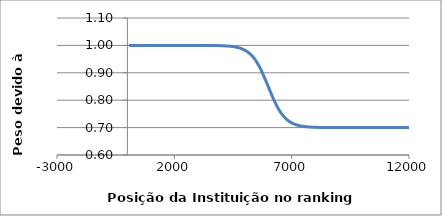
| Category | Series 0 |
|---|---|
| 71.0 | 1 |
| 227.0 | 1 |
| 271.0 | 1 |
| 369.0 | 1 |
| 408.0 | 1 |
| 420.0 | 1 |
| 448.0 | 1 |
| 640.0 | 1 |
| 691.0 | 1 |
| 737.0 | 1 |
| 746.0 | 1 |
| 750.0 | 1 |
| 802.0 | 1 |
| 822.0 | 1 |
| 822.0 | 1 |
| 827.0 | 1 |
| 850.0 | 1 |
| 945.0 | 1 |
| 960.0 | 1 |
| 1107.0 | 1 |
| 1109.0 | 1 |
| 1183.0 | 1 |
| 1187.0 | 1 |
| 1190.0 | 1 |
| 1251.0 | 1 |
| 1270.0 | 1 |
| 1276.0 | 1 |
| 1334.0 | 1 |
| 1340.0 | 1 |
| 1349.0 | 1 |
| 1454.0 | 1 |
| 1492.0 | 1 |
| 1534.0 | 1 |
| 1609.0 | 1 |
| 1686.0 | 1 |
| 1703.0 | 1 |
| 1716.0 | 1 |
| 1719.0 | 1 |
| 1745.0 | 1 |
| 1763.0 | 1 |
| 1815.0 | 1 |
| 1880.0 | 1 |
| 1927.0 | 1 |
| 1946.0 | 1 |
| 1954.0 | 1 |
| 2006.0 | 1 |
| 2032.0 | 1 |
| 2116.0 | 1 |
| 2116.0 | 1 |
| 2139.0 | 1 |
| 2199.0 | 1 |
| 2214.0 | 1 |
| 2214.0 | 1 |
| 2221.0 | 1 |
| 2233.0 | 1 |
| 2240.0 | 1 |
| 2280.0 | 1 |
| 2390.0 | 1 |
| 2402.0 | 1 |
| 2407.0 | 1 |
| 2411.0 | 1 |
| 2416.0 | 1 |
| 2421.0 | 1 |
| 2436.0 | 1 |
| 2464.0 | 1 |
| 2476.0 | 1 |
| 2598.0 | 1 |
| 2654.0 | 1 |
| 2658.0 | 1 |
| 2663.0 | 1 |
| 2698.0 | 1 |
| 2702.0 | 1 |
| 2712.0 | 1 |
| 2728.0 | 1 |
| 2770.0 | 1 |
| 2788.0 | 1 |
| 2807.0 | 1 |
| 2809.0 | 1 |
| 2833.0 | 1 |
| 2837.0 | 1 |
| 2882.0 | 1 |
| 2897.0 | 1 |
| 2934.0 | 1 |
| 2969.0 | 1 |
| 2987.0 | 1 |
| 3000.0 | 1 |
| 3013.0 | 1 |
| 3057.0 | 1 |
| 3071.0 | 1 |
| 3081.0 | 1 |
| 3123.0 | 1 |
| 3123.0 | 1 |
| 3126.0 | 1 |
| 3131.0 | 1 |
| 3141.0 | 1 |
| 3160.0 | 1 |
| 3180.0 | 1 |
| 3185.0 | 1 |
| 3194.0 | 1 |
| 3203.0 | 1 |
| 3218.0 | 1 |
| 3221.0 | 1 |
| 3240.0 | 1 |
| 3257.0 | 1 |
| 3271.0 | 1 |
| 3277.0 | 1 |
| 3314.0 | 1 |
| 3403.0 | 1 |
| 3413.0 | 1 |
| 3416.0 | 1 |
| 3420.0 | 1 |
| 3486.0 | 1 |
| 3509.0 | 1 |
| 3514.0 | 1 |
| 3515.0 | 1 |
| 3522.0 | 1 |
| 3537.0 | 1 |
| 3540.0 | 1 |
| 3551.0 | 1 |
| 3554.0 | 1 |
| 3571.0 | 1 |
| 3597.0 | 1 |
| 3599.0 | 1 |
| 3617.0 | 1 |
| 3617.0 | 1 |
| 3629.0 | 1 |
| 3635.0 | 1 |
| 3649.0 | 1 |
| 3664.0 | 1 |
| 3668.0 | 1 |
| 3680.0 | 1 |
| 3680.0 | 1 |
| 3700.0 | 1 |
| 3716.0 | 0.999 |
| 3720.0 | 0.999 |
| 3760.0 | 0.999 |
| 3788.0 | 0.999 |
| 3809.0 | 0.999 |
| 3839.0 | 0.999 |
| 3852.0 | 0.999 |
| 3857.0 | 0.999 |
| 3861.0 | 0.999 |
| 3885.0 | 0.999 |
| 3915.0 | 0.999 |
| 3937.0 | 0.999 |
| 3950.0 | 0.999 |
| 3957.0 | 0.999 |
| 3980.0 | 0.999 |
| 4028.0 | 0.999 |
| 4035.0 | 0.999 |
| 4069.0 | 0.999 |
| 4089.0 | 0.999 |
| 4109.0 | 0.999 |
| 4147.0 | 0.998 |
| 4220.0 | 0.998 |
| 4230.0 | 0.998 |
| 4233.0 | 0.998 |
| 4254.0 | 0.998 |
| 4375.0 | 0.997 |
| 4450.0 | 0.996 |
| 4459.0 | 0.996 |
| 4504.0 | 0.996 |
| 4553.0 | 0.995 |
| 4580.0 | 0.994 |
| 4582.0 | 0.994 |
| 4591.0 | 0.994 |
| 4636.0 | 0.994 |
| 4652.0 | 0.993 |
| 4667.0 | 0.993 |
| 4707.0 | 0.992 |
| 4718.0 | 0.992 |
| 4782.0 | 0.99 |
| 4854.0 | 0.988 |
| 4885.0 | 0.987 |
| 4978.0 | 0.984 |
| 4990.0 | 0.983 |
| 5088.0 | 0.978 |
| 5154.0 | 0.974 |
| 5181.0 | 0.972 |
| 5193.0 | 0.972 |
| 5255.0 | 0.967 |
| 5267.0 | 0.966 |
| 5272.0 | 0.965 |
| 5277.0 | 0.965 |
| 5326.0 | 0.961 |
| 5353.0 | 0.958 |
| 5387.0 | 0.954 |
| 5392.0 | 0.954 |
| 5419.0 | 0.951 |
| 5437.0 | 0.949 |
| 5479.0 | 0.943 |
| 5486.0 | 0.942 |
| 5509.0 | 0.939 |
| 5539.0 | 0.935 |
| 5601.0 | 0.926 |
| 5612.0 | 0.924 |
| 5626.0 | 0.922 |
| 5644.0 | 0.919 |
| 5669.0 | 0.915 |
| 5725.0 | 0.905 |
| 5732.0 | 0.904 |
| 5891.0 | 0.873 |
| 5895.0 | 0.872 |
| 5930.0 | 0.865 |
| 5937.0 | 0.863 |
| 6029.0 | 0.844 |
| 6043.0 | 0.841 |
| 6058.0 | 0.838 |
| 6163.0 | 0.816 |
| 6222.0 | 0.805 |
| 6222.0 | 0.805 |
| 6314.0 | 0.788 |
| 6322.0 | 0.787 |
| 6410.0 | 0.772 |
| 6423.0 | 0.77 |
| 6501.0 | 0.759 |
| 6589.0 | 0.748 |
| 6589.0 | 0.748 |
| 6615.0 | 0.745 |
| 6622.0 | 0.745 |
| 6688.0 | 0.738 |
| 6723.0 | 0.735 |
| 6755.0 | 0.732 |
| 6784.0 | 0.73 |
| 6800.0 | 0.729 |
| 6808.0 | 0.728 |
| 6856.0 | 0.725 |
| 6856.0 | 0.725 |
| 6867.0 | 0.724 |
| 6900.0 | 0.722 |
| 6905.0 | 0.722 |
| 6949.0 | 0.72 |
| 7017.0 | 0.716 |
| 7115.0 | 0.713 |
| 7123.0 | 0.712 |
| 7125.0 | 0.712 |
| 7224.0 | 0.709 |
| 7231.0 | 0.709 |
| 7293.0 | 0.708 |
| 7323.0 | 0.707 |
| 7360.0 | 0.707 |
| 7498.0 | 0.704 |
| 7569.0 | 0.704 |
| 7589.0 | 0.703 |
| 7598.0 | 0.703 |
| 7611.0 | 0.703 |
| 7666.0 | 0.703 |
| 7683.0 | 0.703 |
| 7687.0 | 0.703 |
| 7741.0 | 0.702 |
| 7754.0 | 0.702 |
| 7778.0 | 0.702 |
| 7783.0 | 0.702 |
| 7808.0 | 0.702 |
| 7816.0 | 0.702 |
| 7832.0 | 0.702 |
| 7841.0 | 0.702 |
| 7853.0 | 0.702 |
| 7875.0 | 0.702 |
| 7893.0 | 0.701 |
| 7926.0 | 0.701 |
| 7939.0 | 0.701 |
| 7939.0 | 0.701 |
| 7968.0 | 0.701 |
| 8053.0 | 0.701 |
| 8090.0 | 0.701 |
| 8205.0 | 0.701 |
| 8220.0 | 0.701 |
| 8266.0 | 0.701 |
| 8291.0 | 0.7 |
| 8388.0 | 0.7 |
| 8538.0 | 0.7 |
| 8538.0 | 0.7 |
| 8553.0 | 0.7 |
| 8613.0 | 0.7 |
| 8643.0 | 0.7 |
| 8685.0 | 0.7 |
| 8685.0 | 0.7 |
| 8898.0 | 0.7 |
| 8942.0 | 0.7 |
| 9110.0 | 0.7 |
| 9170.0 | 0.7 |
| 9203.0 | 0.7 |
| 9215.0 | 0.7 |
| 9244.0 | 0.7 |
| 9273.0 | 0.7 |
| 9384.0 | 0.7 |
| 9384.0 | 0.7 |
| 9458.0 | 0.7 |
| 9472.0 | 0.7 |
| 9568.0 | 0.7 |
| 9688.0 | 0.7 |
| 9719.0 | 0.7 |
| 9757.0 | 0.7 |
| 9877.0 | 0.7 |
| 9924.0 | 0.7 |
| 9951.0 | 0.7 |
| 9978.0 | 0.7 |
| 10008.0 | 0.7 |
| 10053.0 | 0.7 |
| 10110.0 | 0.7 |
| 10180.0 | 0.7 |
| 10229.0 | 0.7 |
| 10236.0 | 0.7 |
| 10325.0 | 0.7 |
| 10348.0 | 0.7 |
| 10392.0 | 0.7 |
| 10439.0 | 0.7 |
| 10463.0 | 0.7 |
| 10505.0 | 0.7 |
| 10552.0 | 0.7 |
| 10643.0 | 0.7 |
| 10737.0 | 0.7 |
| 10762.0 | 0.7 |
| 10806.0 | 0.7 |
| 10817.0 | 0.7 |
| 10817.0 | 0.7 |
| 10831.0 | 0.7 |
| 10860.0 | 0.7 |
| 10926.0 | 0.7 |
| 10935.0 | 0.7 |
| 10935.0 | 0.7 |
| 10935.0 | 0.7 |
| 10972.0 | 0.7 |
| 11037.0 | 0.7 |
| 11052.0 | 0.7 |
| 11064.0 | 0.7 |
| 11085.0 | 0.7 |
| 11118.0 | 0.7 |
| 11144.0 | 0.7 |
| 11154.0 | 0.7 |
| 11177.0 | 0.7 |
| 11237.0 | 0.7 |
| 11265.0 | 0.7 |
| 11306.0 | 0.7 |
| 11315.0 | 0.7 |
| 11378.0 | 0.7 |
| 11412.0 | 0.7 |
| 11501.0 | 0.7 |
| 11547.0 | 0.7 |
| 11562.0 | 0.7 |
| 11584.0 | 0.7 |
| 11671.0 | 0.7 |
| 11762.0 | 0.7 |
| 11797.0 | 0.7 |
| 11872.0 | 0.7 |
| 11885.0 | 0.7 |
| 11944.0 | 0.7 |
| 11986.0 | 0.7 |
| 11999.0 | 0.7 |
| 12065.0 | 0.7 |
| 12085.0 | 0.7 |
| 12093.0 | 0.7 |
| 12126.0 | 0.7 |
| 12162.0 | 0.7 |
| 12175.0 | 0.7 |
| 12188.0 | 0.7 |
| 12240.0 | 0.7 |
| 12295.0 | 0.7 |
| 12349.0 | 0.7 |
| 12355.0 | 0.7 |
| 12377.0 | 0.7 |
| 12420.0 | 0.7 |
| 12443.0 | 0.7 |
| 12468.0 | 0.7 |
| 12517.0 | 0.7 |
| 12532.0 | 0.7 |
| 12563.0 | 0.7 |
| 12615.0 | 0.7 |
| 12701.0 | 0.7 |
| 12772.0 | 0.7 |
| 12808.0 | 0.7 |
| 12827.0 | 0.7 |
| 12867.0 | 0.7 |
| 12897.0 | 0.7 |
| 12897.0 | 0.7 |
| 12912.0 | 0.7 |
| 12912.0 | 0.7 |
| 12935.0 | 0.7 |
| 12935.0 | 0.7 |
| 12955.0 | 0.7 |
| 12955.0 | 0.7 |
| 13056.0 | 0.7 |
| 13080.0 | 0.7 |
| 13110.0 | 0.7 |
| 13139.0 | 0.7 |
| 13186.0 | 0.7 |
| 13207.0 | 0.7 |
| 13214.0 | 0.7 |
| 13252.0 | 0.7 |
| 13261.0 | 0.7 |
| 13278.0 | 0.7 |
| 13335.0 | 0.7 |
| 13402.0 | 0.7 |
| 13402.0 | 0.7 |
| 13437.0 | 0.7 |
| 13483.0 | 0.7 |
| 13492.0 | 0.7 |
| 13508.0 | 0.7 |
| 13569.0 | 0.7 |
| 13575.0 | 0.7 |
| 13588.0 | 0.7 |
| 13603.0 | 0.7 |
| 13611.0 | 0.7 |
| 13629.0 | 0.7 |
| 13705.0 | 0.7 |
| 13713.0 | 0.7 |
| 13738.0 | 0.7 |
| 13746.0 | 0.7 |
| 13780.0 | 0.7 |
| 13825.0 | 0.7 |
| 13866.0 | 0.7 |
| 13928.0 | 0.7 |
| 13936.0 | 0.7 |
| 13994.0 | 0.7 |
| 14020.0 | 0.7 |
| 14040.0 | 0.7 |
| 14049.0 | 0.7 |
| 14049.0 | 0.7 |
| 14063.0 | 0.7 |
| 14153.0 | 0.7 |
| 14169.0 | 0.7 |
| 14169.0 | 0.7 |
| 14180.0 | 0.7 |
| 14188.0 | 0.7 |
| 14289.0 | 0.7 |
| 14399.0 | 0.7 |
| 14411.0 | 0.7 |
| 14411.0 | 0.7 |
| 14483.0 | 0.7 |
| 14509.0 | 0.7 |
| 14541.0 | 0.7 |
| 14547.0 | 0.7 |
| 14566.0 | 0.7 |
| 14637.0 | 0.7 |
| 14650.0 | 0.7 |
| 14660.0 | 0.7 |
| 14711.0 | 0.7 |
| 14762.0 | 0.7 |
| 14828.0 | 0.7 |
| 14842.0 | 0.7 |
| 14870.0 | 0.7 |
| 14885.0 | 0.7 |
| 14914.0 | 0.7 |
| 14924.0 | 0.7 |
| 14940.0 | 0.7 |
| 14949.0 | 0.7 |
| 14972.0 | 0.7 |
| 15011.0 | 0.7 |
| 15023.0 | 0.7 |
| 15039.0 | 0.7 |
| 15101.0 | 0.7 |
| 15136.0 | 0.7 |
| 15170.0 | 0.7 |
| 15179.0 | 0.7 |
| 15179.0 | 0.7 |
| 15201.0 | 0.7 |
| 15240.0 | 0.7 |
| 15255.0 | 0.7 |
| 15255.0 | 0.7 |
| 15267.0 | 0.7 |
| 15267.0 | 0.7 |
| 15298.0 | 0.7 |
| 15298.0 | 0.7 |
| 15394.0 | 0.7 |
| 15407.0 | 0.7 |
| 15497.0 | 0.7 |
| 15519.0 | 0.7 |
| 15540.0 | 0.7 |
| 15566.0 | 0.7 |
| 15593.0 | 0.7 |
| 15598.0 | 0.7 |
| 15598.0 | 0.7 |
| 15676.0 | 0.7 |
| 15702.0 | 0.7 |
| 15702.0 | 0.7 |
| 15769.0 | 0.7 |
| 15792.0 | 0.7 |
| 15812.0 | 0.7 |
| 15852.0 | 0.7 |
| 15863.0 | 0.7 |
| 15934.0 | 0.7 |
| 16046.0 | 0.7 |
| 16089.0 | 0.7 |
| 16115.0 | 0.7 |
| 16115.0 | 0.7 |
| 16144.0 | 0.7 |
| 16199.0 | 0.7 |
| 16214.0 | 0.7 |
| 16227.0 | 0.7 |
| 16278.0 | 0.7 |
| 16299.0 | 0.7 |
| 16328.0 | 0.7 |
| 16475.0 | 0.7 |
| 16475.0 | 0.7 |
| 16508.0 | 0.7 |
| 16526.0 | 0.7 |
| 16526.0 | 0.7 |
| 16539.0 | 0.7 |
| 16556.0 | 0.7 |
| 16565.0 | 0.7 |
| 16572.0 | 0.7 |
| 16591.0 | 0.7 |
| 16631.0 | 0.7 |
| 16631.0 | 0.7 |
| 16631.0 | 0.7 |
| 16675.0 | 0.7 |
| 16687.0 | 0.7 |
| 16696.0 | 0.7 |
| 16696.0 | 0.7 |
| 16708.0 | 0.7 |
| 16759.0 | 0.7 |
| 16801.0 | 0.7 |
| 16801.0 | 0.7 |
| 16837.0 | 0.7 |
| 16846.0 | 0.7 |
| 16854.0 | 0.7 |
| 16854.0 | 0.7 |
| 16854.0 | 0.7 |
| 16893.0 | 0.7 |
| 16908.0 | 0.7 |
| 16916.0 | 0.7 |
| 16930.0 | 0.7 |
| 16946.0 | 0.7 |
| 16957.0 | 0.7 |
| 16957.0 | 0.7 |
| 16966.0 | 0.7 |
| 16974.0 | 0.7 |
| 16974.0 | 0.7 |
| 17014.0 | 0.7 |
| 17025.0 | 0.7 |
| 17092.0 | 0.7 |
| 17141.0 | 0.7 |
| 17141.0 | 0.7 |
| 17168.0 | 0.7 |
| 17168.0 | 0.7 |
| 17182.0 | 0.7 |
| 17182.0 | 0.7 |
| 17258.0 | 0.7 |
| 17268.0 | 0.7 |
| 17275.0 | 0.7 |
| 17285.0 | 0.7 |
| 17292.0 | 0.7 |
| 17323.0 | 0.7 |
| 17333.0 | 0.7 |
| 17333.0 | 0.7 |
| 17346.0 | 0.7 |
| 17371.0 | 0.7 |
| 17399.0 | 0.7 |
| 17399.0 | 0.7 |
| 17399.0 | 0.7 |
| 17414.0 | 0.7 |
| 17426.0 | 0.7 |
| 17436.0 | 0.7 |
| 17444.0 | 0.7 |
| 17455.0 | 0.7 |
| 17492.0 | 0.7 |
| 17512.0 | 0.7 |
| 17512.0 | 0.7 |
| 17551.0 | 0.7 |
| 17568.0 | 0.7 |
| 17581.0 | 0.7 |
| 17594.0 | 0.7 |
| 17623.0 | 0.7 |
| 17645.0 | 0.7 |
| 17674.0 | 0.7 |
| 17703.0 | 0.7 |
| 17727.0 | 0.7 |
| 17746.0 | 0.7 |
| 17808.0 | 0.7 |
| 17820.0 | 0.7 |
| 17886.0 | 0.7 |
| 17892.0 | 0.7 |
| 17892.0 | 0.7 |
| 17918.0 | 0.7 |
| 17957.0 | 0.7 |
| 17968.0 | 0.7 |
| 17988.0 | 0.7 |
| 18016.0 | 0.7 |
| 18028.0 | 0.7 |
| 18039.0 | 0.7 |
| 18091.0 | 0.7 |
| 18091.0 | 0.7 |
| 18104.0 | 0.7 |
| 18104.0 | 0.7 |
| 18115.0 | 0.7 |
| 18115.0 | 0.7 |
| 18138.0 | 0.7 |
| 18138.0 | 0.7 |
| 18154.0 | 0.7 |
| 18154.0 | 0.7 |
| 18171.0 | 0.7 |
| 18185.0 | 0.7 |
| 18206.0 | 0.7 |
| 18239.0 | 0.7 |
| 18258.0 | 0.7 |
| 18269.0 | 0.7 |
| 18275.0 | 0.7 |
| 18283.0 | 0.7 |
| 18293.0 | 0.7 |
| 18301.0 | 0.7 |
| 18301.0 | 0.7 |
| 18301.0 | 0.7 |
| 18321.0 | 0.7 |
| 18321.0 | 0.7 |
| 18339.0 | 0.7 |
| 18359.0 | 0.7 |
| 18378.0 | 0.7 |
| 18391.0 | 0.7 |
| 18403.0 | 0.7 |
| 18403.0 | 0.7 |
| 18412.0 | 0.7 |
| 18412.0 | 0.7 |
| 18412.0 | 0.7 |
| 18420.0 | 0.7 |
| 18427.0 | 0.7 |
| 18427.0 | 0.7 |
| 18435.0 | 0.7 |
| 18441.0 | 0.7 |
| 18441.0 | 0.7 |
| 18451.0 | 0.7 |
| 18482.0 | 0.7 |
| 18494.0 | 0.7 |
| 18505.0 | 0.7 |
| 18505.0 | 0.7 |
| 18513.0 | 0.7 |
| 18526.0 | 0.7 |
| 18556.0 | 0.7 |
| 18570.0 | 0.7 |
| 18585.0 | 0.7 |
| 18599.0 | 0.7 |
| 18605.0 | 0.7 |
| 18616.0 | 0.7 |
| 18636.0 | 0.7 |
| 18646.0 | 0.7 |
| 18671.0 | 0.7 |
| 18689.0 | 0.7 |
| 18723.0 | 0.7 |
| 18723.0 | 0.7 |
| 18740.0 | 0.7 |
| 18779.0 | 0.7 |
| 18791.0 | 0.7 |
| 18800.0 | 0.7 |
| 18845.0 | 0.7 |
| 18854.0 | 0.7 |
| 18865.0 | 0.7 |
| 18889.0 | 0.7 |
| 18903.0 | 0.7 |
| 18903.0 | 0.7 |
| 18919.0 | 0.7 |
| 18919.0 | 0.7 |
| 18950.0 | 0.7 |
| 18990.0 | 0.7 |
| 19003.0 | 0.7 |
| 19003.0 | 0.7 |
| 19020.0 | 0.7 |
| 19035.0 | 0.7 |
| 19043.0 | 0.7 |
| 19043.0 | 0.7 |
| 19057.0 | 0.7 |
| 19057.0 | 0.7 |
| 19064.0 | 0.7 |
| 19087.0 | 0.7 |
| 19087.0 | 0.7 |
| 19121.0 | 0.7 |
| 19130.0 | 0.7 |
| 19139.0 | 0.7 |
| 19147.0 | 0.7 |
| 19147.0 | 0.7 |
| 19171.0 | 0.7 |
| 19194.0 | 0.7 |
| 19215.0 | 0.7 |
| 19228.0 | 0.7 |
| 19263.0 | 0.7 |
| 19276.0 | 0.7 |
| 19276.0 | 0.7 |
| 19293.0 | 0.7 |
| 19320.0 | 0.7 |
| 19336.0 | 0.7 |
| 19336.0 | 0.7 |
| 19367.0 | 0.7 |
| 19414.0 | 0.7 |
| 19425.0 | 0.7 |
| 19425.0 | 0.7 |
| 19440.0 | 0.7 |
| 19440.0 | 0.7 |
| 19450.0 | 0.7 |
| 19450.0 | 0.7 |
| 19479.0 | 0.7 |
| 19479.0 | 0.7 |
| 19489.0 | 0.7 |
| 19489.0 | 0.7 |
| 19489.0 | 0.7 |
| 19489.0 | 0.7 |
| 19498.0 | 0.7 |
| 19498.0 | 0.7 |
| 19538.0 | 0.7 |
| 19538.0 | 0.7 |
| 19538.0 | 0.7 |
| 19549.0 | 0.7 |
| 19560.0 | 0.7 |
| 19560.0 | 0.7 |
| 19589.0 | 0.7 |
| 19589.0 | 0.7 |
| 19589.0 | 0.7 |
| 19589.0 | 0.7 |
| 19608.0 | 0.7 |
| 19608.0 | 0.7 |
| 19615.0 | 0.7 |
| 19615.0 | 0.7 |
| 19615.0 | 0.7 |
| 19632.0 | 0.7 |
| 19640.0 | 0.7 |
| 19666.0 | 0.7 |
| 19677.0 | 0.7 |
| 19693.0 | 0.7 |
| 19693.0 | 0.7 |
| 19693.0 | 0.7 |
| 19693.0 | 0.7 |
| 19700.0 | 0.7 |
| 19708.0 | 0.7 |
| 19726.0 | 0.7 |
| 19738.0 | 0.7 |
| 19750.0 | 0.7 |
| 19761.0 | 0.7 |
| 19761.0 | 0.7 |
| 19765.0 | 0.7 |
| 19765.0 | 0.7 |
| 19775.0 | 0.7 |
| 19775.0 | 0.7 |
| 19775.0 | 0.7 |
| 19784.0 | 0.7 |
| 19784.0 | 0.7 |
| 19784.0 | 0.7 |
| 19804.0 | 0.7 |
| 19822.0 | 0.7 |
| 19833.0 | 0.7 |
| 19846.0 | 0.7 |
| 19846.0 | 0.7 |
| 19846.0 | 0.7 |
| 19856.0 | 0.7 |
| 19856.0 | 0.7 |
| 19866.0 | 0.7 |
| 19866.0 | 0.7 |
| 19866.0 | 0.7 |
| 19893.0 | 0.7 |
| 19893.0 | 0.7 |
| 19893.0 | 0.7 |
| 19906.0 | 0.7 |
| 19906.0 | 0.7 |
| 19932.0 | 0.7 |
| 19932.0 | 0.7 |
| 19942.0 | 0.7 |
| 19952.0 | 0.7 |
| 19952.0 | 0.7 |
| 19961.0 | 0.7 |
| 19961.0 | 0.7 |
| 19973.0 | 0.7 |
| 19979.0 | 0.7 |
| 19998.0 | 0.7 |
| 19998.0 | 0.7 |
| 20023.0 | 0.7 |
| 20037.0 | 0.7 |
| 20061.0 | 0.7 |
| 20098.0 | 0.7 |
| 20098.0 | 0.7 |
| 20133.0 | 0.7 |
| 20150.0 | 0.7 |
| 20158.0 | 0.7 |
| 20158.0 | 0.7 |
| 20158.0 | 0.7 |
| 20170.0 | 0.7 |
| 20170.0 | 0.7 |
| 20170.0 | 0.7 |
| 20181.0 | 0.7 |
| 20181.0 | 0.7 |
| 20181.0 | 0.7 |
| 20181.0 | 0.7 |
| 20213.0 | 0.7 |
| 20213.0 | 0.7 |
| 20213.0 | 0.7 |
| 20239.0 | 0.7 |
| 20250.0 | 0.7 |
| 20263.0 | 0.7 |
| 20263.0 | 0.7 |
| 20272.0 | 0.7 |
| 20293.0 | 0.7 |
| 20293.0 | 0.7 |
| 20293.0 | 0.7 |
| 20293.0 | 0.7 |
| 20302.0 | 0.7 |
| 20309.0 | 0.7 |
| 20309.0 | 0.7 |
| 20309.0 | 0.7 |
| 20325.0 | 0.7 |
| 20325.0 | 0.7 |
| 20325.0 | 0.7 |
| 20338.0 | 0.7 |
| 20352.0 | 0.7 |
| 20352.0 | 0.7 |
| 20352.0 | 0.7 |
| 20365.0 | 0.7 |
| 20383.0 | 0.7 |
| 20383.0 | 0.7 |
| 20395.0 | 0.7 |
| 20407.0 | 0.7 |
| 20414.0 | 0.7 |
| 20414.0 | 0.7 |
| 20439.0 | 0.7 |
| 20439.0 | 0.7 |
| 20453.0 | 0.7 |
| 20453.0 | 0.7 |
| 20492.0 | 0.7 |
| 20492.0 | 0.7 |
| 20511.0 | 0.7 |
| 20511.0 | 0.7 |
| 20533.0 | 0.7 |
| 20544.0 | 0.7 |
| 20553.0 | 0.7 |
| 20563.0 | 0.7 |
| 20568.0 | 0.7 |
| 20568.0 | 0.7 |
| 20568.0 | 0.7 |
| 20586.0 | 0.7 |
| 20596.0 | 0.7 |
| 20614.0 | 0.7 |
| 20625.0 | 0.7 |
| 20625.0 | 0.7 |
| 20632.0 | 0.7 |
| 20653.0 | 0.7 |
| 20665.0 | 0.7 |
| 20665.0 | 0.7 |
| 20678.0 | 0.7 |
| 20678.0 | 0.7 |
| 20678.0 | 0.7 |
| 20699.0 | 0.7 |
| 20729.0 | 0.7 |
| 20729.0 | 0.7 |
| 20737.0 | 0.7 |
| 20742.0 | 0.7 |
| 20742.0 | 0.7 |
| 20749.0 | 0.7 |
| 20780.0 | 0.7 |
| 20791.0 | 0.7 |
| 20800.0 | 0.7 |
| 20818.0 | 0.7 |
| 20818.0 | 0.7 |
| 20818.0 | 0.7 |
| 20818.0 | 0.7 |
| 20831.0 | 0.7 |
| 20859.0 | 0.7 |
| 20868.0 | 0.7 |
| 20880.0 | 0.7 |
| 20889.0 | 0.7 |
| 20902.0 | 0.7 |
| 20923.0 | 0.7 |
| 20930.0 | 0.7 |
| 20942.0 | 0.7 |
| 20970.0 | 0.7 |
| 20970.0 | 0.7 |
| 20995.0 | 0.7 |
| 21003.0 | 0.7 |
| 21018.0 | 0.7 |
| 21037.0 | 0.7 |
| 21055.0 | 0.7 |
| 21072.0 | 0.7 |
| 21093.0 | 0.7 |
| 21093.0 | 0.7 |
| 21093.0 | 0.7 |
| 21110.0 | 0.7 |
| 21110.0 | 0.7 |
| 21133.0 | 0.7 |
| 21133.0 | 0.7 |
| 21133.0 | 0.7 |
| 21143.0 | 0.7 |
| 21166.0 | 0.7 |
| 21176.0 | 0.7 |
| 21176.0 | 0.7 |
| 21184.0 | 0.7 |
| 21193.0 | 0.7 |
| 21209.0 | 0.7 |
| 21221.0 | 0.7 |
| 21241.0 | 0.7 |
| 21241.0 | 0.7 |
| 21248.0 | 0.7 |
| 21257.0 | 0.7 |
| 21257.0 | 0.7 |
| 21257.0 | 0.7 |
| 21266.0 | 0.7 |
| 21288.0 | 0.7 |
| 21288.0 | 0.7 |
| 21288.0 | 0.7 |
| 21288.0 | 0.7 |
| 21299.0 | 0.7 |
| 21312.0 | 0.7 |
| 21334.0 | 0.7 |
| 21345.0 | 0.7 |
| 21345.0 | 0.7 |
| 21355.0 | 0.7 |
| 21355.0 | 0.7 |
| 21372.0 | 0.7 |
| 21380.0 | 0.7 |
| 21391.0 | 0.7 |
| 21415.0 | 0.7 |
| 21415.0 | 0.7 |
| 21427.0 | 0.7 |
| 21444.0 | 0.7 |
| 21444.0 | 0.7 |
| 21452.0 | 0.7 |
| 21463.0 | 0.7 |
| 21480.0 | 0.7 |
| 21499.0 | 0.7 |
| 21508.0 | 0.7 |
| 21508.0 | 0.7 |
| 21520.0 | 0.7 |
| 21520.0 | 0.7 |
| 21520.0 | 0.7 |
| 21562.0 | 0.7 |
| 21606.0 | 0.7 |
| 21616.0 | 0.7 |
| 21616.0 | 0.7 |
| 21631.0 | 0.7 |
| 21647.0 | 0.7 |
| 21647.0 | 0.7 |
| 21654.0 | 0.7 |
| 21662.0 | 0.7 |
| 21662.0 | 0.7 |
| 21662.0 | 0.7 |
| 21677.0 | 0.7 |
| 21685.0 | 0.7 |
| 21693.0 | 0.7 |
| 21705.0 | 0.7 |
| 21705.0 | 0.7 |
| 21715.0 | 0.7 |
| 21722.0 | 0.7 |
| 21722.0 | 0.7 |
| 21733.0 | 0.7 |
| 21733.0 | 0.7 |
| 21733.0 | 0.7 |
| 21743.0 | 0.7 |
| 21751.0 | 0.7 |
| 21766.0 | 0.7 |
| 21766.0 | 0.7 |
| 21776.0 | 0.7 |
| 21787.0 | 0.7 |
| 21787.0 | 0.7 |
| 21794.0 | 0.7 |
| 21806.0 | 0.7 |
| 21806.0 | 0.7 |
| 21849.0 | 0.7 |
| 21857.0 | 0.7 |
| 21868.0 | 0.7 |
| 21890.0 | 0.7 |
| 21890.0 | 0.7 |
| 21893.0 | 0.7 |
| 21893.0 | 0.7 |
| 21911.0 | 0.7 |
| 21920.0 | 0.7 |
| 21920.0 | 0.7 |
| 21932.0 | 0.7 |
| 21932.0 | 0.7 |
| 21940.0 | 0.7 |
| 21953.0 | 0.7 |
| 21953.0 | 0.7 |
| 21964.0 | 0.7 |
| 21999.0 | 0.7 |
| 22006.0 | 0.7 |
| 22006.0 | 0.7 |
| 22029.0 | 0.7 |
| 22042.0 | 0.7 |
| 22064.0 | 0.7 |
| 22064.0 | 0.7 |
| 22064.0 | 0.7 |
| 22064.0 | 0.7 |
| 22086.0 | 0.7 |
| 22086.0 | 0.7 |
| 22119.0 | 0.7 |
| 22129.0 | 0.7 |
| 22150.0 | 0.7 |
| 22167.0 | 0.7 |
| 22184.0 | 0.7 |
| 22215.0 | 0.7 |
| 22215.0 | 0.7 |
| 22215.0 | 0.7 |
| 22215.0 | 0.7 |
| 22232.0 | 0.7 |
| 22246.0 | 0.7 |
| 22253.0 | 0.7 |
| 22253.0 | 0.7 |
| 22260.0 | 0.7 |
| 22260.0 | 0.7 |
| 22278.0 | 0.7 |
| 22295.0 | 0.7 |
| 22314.0 | 0.7 |
| 22321.0 | 0.7 |
| 22329.0 | 0.7 |
| 22329.0 | 0.7 |
| 22338.0 | 0.7 |
| 22352.0 | 0.7 |
| 22352.0 | 0.7 |
| 22352.0 | 0.7 |
| 22363.0 | 0.7 |
| 22370.0 | 0.7 |
| 22370.0 | 0.7 |
| 22381.0 | 0.7 |
| 22381.0 | 0.7 |
| 22395.0 | 0.7 |
| 22403.0 | 0.7 |
| 22409.0 | 0.7 |
| 22420.0 | 0.7 |
| 22420.0 | 0.7 |
| 22441.0 | 0.7 |
| 22454.0 | 0.7 |
| 22461.0 | 0.7 |
| 22477.0 | 0.7 |
| 22477.0 | 0.7 |
| 22488.0 | 0.7 |
| 22488.0 | 0.7 |
| 22488.0 | 0.7 |
| 22501.0 | 0.7 |
| 22508.0 | 0.7 |
| 22536.0 | 0.7 |
| 22545.0 | 0.7 |
| 22545.0 | 0.7 |
| 22545.0 | 0.7 |
| 22555.0 | 0.7 |
| 22555.0 | 0.7 |
| 22564.0 | 0.7 |
| 22564.0 | 0.7 |
| 22564.0 | 0.7 |
| 22564.0 | 0.7 |
| 22573.0 | 0.7 |
| 22579.0 | 0.7 |
| 22579.0 | 0.7 |
| 22579.0 | 0.7 |
| 22585.0 | 0.7 |
| 22585.0 | 0.7 |
| 22585.0 | 0.7 |
| 22585.0 | 0.7 |
| 22606.0 | 0.7 |
| 22614.0 | 0.7 |
| 22614.0 | 0.7 |
| 22622.0 | 0.7 |
| 22627.0 | 0.7 |
| 22662.0 | 0.7 |
| 22662.0 | 0.7 |
| 22678.0 | 0.7 |
| 22678.0 | 0.7 |
| 22694.0 | 0.7 |
| 22715.0 | 0.7 |
| 22717.0 | 0.7 |
| 22722.0 | 0.7 |
| 22730.0 | 0.7 |
| 22735.0 | 0.7 |
| 22745.0 | 0.7 |
| 22758.0 | 0.7 |
| 22758.0 | 0.7 |
| 22758.0 | 0.7 |
| 22766.0 | 0.7 |
| 22766.0 | 0.7 |
| 22766.0 | 0.7 |
| 22766.0 | 0.7 |
| 22785.0 | 0.7 |
| 22785.0 | 0.7 |
| 22796.0 | 0.7 |
| 22801.0 | 0.7 |
| 22822.0 | 0.7 |
| 22833.0 | 0.7 |
| 22833.0 | 0.7 |
| 22833.0 | 0.7 |
| 22833.0 | 0.7 |
| 22853.0 | 0.7 |
| 22864.0 | 0.7 |
| 22872.0 | 0.7 |
| 22872.0 | 0.7 |
| 22891.0 | 0.7 |
| 22891.0 | 0.7 |
| 22899.0 | 0.7 |
| 22913.0 | 0.7 |
| 22915.0 | 0.7 |
| 22919.0 | 0.7 |
| 22919.0 | 0.7 |
| 22975.0 | 0.7 |
| 22975.0 | 0.7 |
| 22993.0 | 0.7 |
| 22993.0 | 0.7 |
| 22993.0 | 0.7 |
| 23024.0 | 0.7 |
| 23024.0 | 0.7 |
| 23024.0 | 0.7 |
| 23035.0 | 0.7 |
| 23045.0 | 0.7 |
| 23045.0 | 0.7 |
| 23053.0 | 0.7 |
| 23063.0 | 0.7 |
| 23072.0 | 0.7 |
| 23097.0 | 0.7 |
| 23097.0 | 0.7 |
| 23097.0 | 0.7 |
| 23112.0 | 0.7 |
| 23116.0 | 0.7 |
| 23123.0 | 0.7 |
| 23135.0 | 0.7 |
| 23135.0 | 0.7 |
| 23146.0 | 0.7 |
| 23146.0 | 0.7 |
| 23172.0 | 0.7 |
| 23188.0 | 0.7 |
| 23194.0 | 0.7 |
| 23194.0 | 0.7 |
| 23204.0 | 0.7 |
| 23204.0 | 0.7 |
| 23252.0 | 0.7 |
| 23252.0 | 0.7 |
| 23261.0 | 0.7 |
| 23281.0 | 0.7 |
| 23281.0 | 0.7 |
| 23287.0 | 0.7 |
| 23292.0 | 0.7 |
| 23292.0 | 0.7 |
| 23299.0 | 0.7 |
| 23307.0 | 0.7 |
| 23307.0 | 0.7 |
| 23330.0 | 0.7 |
| 23338.0 | 0.7 |
| 23357.0 | 0.7 |
| 23357.0 | 0.7 |
| 23357.0 | 0.7 |
| 23381.0 | 0.7 |
| 23381.0 | 0.7 |
| 23381.0 | 0.7 |
| 23391.0 | 0.7 |
| 23399.0 | 0.7 |
| 23423.0 | 0.7 |
| 23434.0 | 0.7 |
| 23434.0 | 0.7 |
| 23454.0 | 0.7 |
| 23467.0 | 0.7 |
| 23467.0 | 0.7 |
| 23477.0 | 0.7 |
| 23483.0 | 0.7 |
| 23483.0 | 0.7 |
| 23499.0 | 0.7 |
| 23499.0 | 0.7 |
| 23507.0 | 0.7 |
| 23507.0 | 0.7 |
| 23527.0 | 0.7 |
| 23546.0 | 0.7 |
| 23560.0 | 0.7 |
| 23576.0 | 0.7 |
| 23589.0 | 0.7 |
| 23615.0 | 0.7 |
| 23631.0 | 0.7 |
| 23631.0 | 0.7 |
| 23631.0 | 0.7 |
| 23649.0 | 0.7 |
| 23649.0 | 0.7 |
| 23666.0 | 0.7 |
| 23677.0 | 0.7 |
| 23677.0 | 0.7 |
| 23692.0 | 0.7 |
| 23692.0 | 0.7 |
| 23703.0 | 0.7 |
| 23703.0 | 0.7 |
| 23703.0 | 0.7 |
| 23703.0 | 0.7 |
| 23732.0 | 0.7 |
| 23732.0 | 0.7 |
| 23741.0 | 0.7 |
| 23741.0 | 0.7 |
| 23750.0 | 0.7 |
| 23761.0 | 0.7 |
| 23773.0 | 0.7 |
| 23773.0 | 0.7 |
| 23773.0 | 0.7 |
| 23803.0 | 0.7 |
| 23831.0 | 0.7 |
| 23842.0 | 0.7 |
| 23866.0 | 0.7 |
| 23866.0 | 0.7 |
| 23866.0 | 0.7 |
| 23887.0 | 0.7 |
| 23895.0 | 0.7 |
| 23935.0 | 0.7 |
| 23935.0 | 0.7 |
| 23940.0 | 0.7 |
| 23972.0 | 0.7 |
| 23984.0 | 0.7 |
| 23990.0 | 0.7 |
| 24013.0 | 0.7 |
| 24013.0 | 0.7 |
| 24019.0 | 0.7 |
| 24019.0 | 0.7 |
| 24033.0 | 0.7 |
| 24033.0 | 0.7 |
| 24033.0 | 0.7 |
| 24033.0 | 0.7 |
| 24064.0 | 0.7 |
| 24091.0 | 0.7 |
| 24097.0 | 0.7 |
| 24105.0 | 0.7 |
| 24117.0 | 0.7 |
| 24143.0 | 0.7 |
| 24143.0 | 0.7 |
| 24149.0 | 0.7 |
| 24154.0 | 0.7 |
| 24174.0 | 0.7 |
| 24183.0 | 0.7 |
| 24186.0 | 0.7 |
| 24195.0 | 0.7 |
| 24202.0 | 0.7 |
| 24224.0 | 0.7 |
| 24231.0 | 0.7 |
| 24231.0 | 0.7 |
| 24240.0 | 0.7 |
| 24248.0 | 0.7 |
| 24267.0 | 0.7 |
| 24267.0 | 0.7 |
| 24267.0 | 0.7 |
| 24267.0 | 0.7 |
| 24280.0 | 0.7 |
| 24296.0 | 0.7 |
| 24296.0 | 0.7 |
| 24296.0 | 0.7 |
| 24311.0 | 0.7 |
| 24330.0 | 0.7 |
| 24337.0 | 0.7 |
| 24367.0 | 0.7 |
| 24382.0 | 0.7 |
| 24392.0 | 0.7 |
| 24413.0 | 0.7 |
| 24413.0 | 0.7 |
| 24423.0 | 0.7 |
| 24448.0 | 0.7 |
| 24448.0 | 0.7 |
| 24460.0 | 0.7 |
| 24466.0 | 0.7 |
| 24480.0 | 0.7 |
| 24485.0 | 0.7 |
| 24485.0 | 0.7 |
| 24510.0 | 0.7 |
| 24516.0 | 0.7 |
| 24516.0 | 0.7 |
| 24525.0 | 0.7 |
| 24545.0 | 0.7 |
| 24553.0 | 0.7 |
| 24560.0 | 0.7 |
| 24569.0 | 0.7 |
| 24569.0 | 0.7 |
| 24577.0 | 0.7 |
| 24577.0 | 0.7 |
| 24596.0 | 0.7 |
| 24599.0 | 0.7 |
| 24604.0 | 0.7 |
| 24604.0 | 0.7 |
| 24607.0 | 0.7 |
| 24641.0 | 0.7 |
| 24655.0 | 0.7 |
| 24668.0 | 0.7 |
| 24671.0 | 0.7 |
| 24687.0 | 0.7 |
| 24693.0 | 0.7 |
| 24709.0 | 0.7 |
| 24715.0 | 0.7 |
| 24726.0 | 0.7 |
| 24743.0 | 0.7 |
| 24753.0 | 0.7 |
| 24753.0 | 0.7 |
| 24790.0 | 0.7 |
| 24795.0 | 0.7 |
| 24795.0 | 0.7 |
| 24806.0 | 0.7 |
| 24809.0 | 0.7 |
| 24816.0 | 0.7 |
| 24823.0 | 0.7 |
| 24831.0 | 0.7 |
| 24870.0 | 0.7 |
| 24874.0 | 0.7 |
| 24885.0 | 0.7 |
| 24905.0 | 0.7 |
| 24915.0 | 0.7 |
| 24927.0 | 0.7 |
| 24939.0 | 0.7 |
| 24972.0 | 0.7 |
| 24985.0 | 0.7 |
| 24985.0 | 0.7 |
| 24994.0 | 0.7 |
| 25003.0 | 0.7 |
| 25003.0 | 0.7 |
| 25017.0 | 0.7 |
| 25035.0 | 0.7 |
| 25045.0 | 0.7 |
| 25052.0 | 0.7 |
| 25055.0 | 0.7 |
| 25080.0 | 0.7 |
| 25089.0 | 0.7 |
| 25096.0 | 0.7 |
| 25112.0 | 0.7 |
| 25116.0 | 0.7 |
| 25137.0 | 0.7 |
| 25144.0 | 0.7 |
| 25144.0 | 0.7 |
| 25148.0 | 0.7 |
| 25155.0 | 0.7 |
| 25162.0 | 0.7 |
| 25171.0 | 0.7 |
| 25181.0 | 0.7 |
| 25190.0 | 0.7 |
| 25210.0 | 0.7 |
| 25210.0 | 0.7 |
| 25225.0 | 0.7 |
| 25239.0 | 0.7 |
| 25249.0 | 0.7 |
| 25253.0 | 0.7 |
| 25253.0 | 0.7 |
| 25263.0 | 0.7 |
| 25273.0 | 0.7 |
| 25279.0 | 0.7 |
| 25303.0 | 0.7 |
| 25322.0 | 0.7 |
| 25329.0 | 0.7 |
| 25329.0 | 0.7 |
| 25334.0 | 0.7 |
| 25341.0 | 0.7 |
| 25360.0 | 0.7 |
| 25366.0 | 0.7 |
| 25370.0 | 0.7 |
| 25370.0 | 0.7 |
| 25400.0 | 0.7 |
| 25411.0 | 0.7 |
| 25411.0 | 0.7 |
| 25420.0 | 0.7 |
| 25431.0 | 0.7 |
| 25464.0 | 0.7 |
| 25502.0 | 0.7 |
| 25507.0 | 0.7 |
| 25525.0 | 0.7 |
| 25529.0 | 0.7 |
| 25542.0 | 0.7 |
| 25542.0 | 0.7 |
| 25546.0 | 0.7 |
| 25546.0 | 0.7 |
| 25574.0 | 0.7 |
| 25579.0 | 0.7 |
| 25579.0 | 0.7 |
| 25593.0 | 0.7 |
| 25597.0 | 0.7 |
| 25609.0 | 0.7 |
| 25630.0 | 0.7 |
| 25657.0 | 0.7 |
| 25692.0 | 0.7 |
| 25710.0 | 0.7 |
| 25729.0 | 0.7 |
| 25730.0 | 0.7 |
| 25756.0 | 0.7 |
| 25756.0 | 0.7 |
| 25763.0 | 0.7 |
| 25807.0 | 0.7 |
| 25837.0 | 0.7 |
| 25879.0 | 0.7 |
| 25879.0 | 0.7 |
| 25904.0 | 0.7 |
| 25911.0 | 0.7 |
| 25928.0 | 0.7 |
| 25951.0 | 0.7 |
| 25953.0 | 0.7 |
| 25962.0 | 0.7 |
| 25970.0 | 0.7 |
| 25974.0 | 0.7 |
| 26003.0 | 0.7 |
| 26018.0 | 0.7 |
| 26022.0 | 0.7 |
| 26036.0 | 0.7 |
| 26036.0 | 0.7 |
| 26075.0 | 0.7 |
| 26089.0 | 0.7 |
| 26090.0 | 0.7 |
| 26090.0 | 0.7 |
| 26106.0 | 0.7 |
| 26125.0 | 0.7 |
| 26152.0 | 0.7 |
| 26163.0 | 0.7 |
| 26163.0 | 0.7 |
| 26172.0 | 0.7 |
| 26175.0 | 0.7 |
| 26204.0 | 0.7 |
| 26209.0 | 0.7 |
| 26215.0 | 0.7 |
| 26236.0 | 0.7 |
| 26249.0 | 0.7 |
| 26258.0 | 0.7 |
| 26258.0 | 0.7 |
| 26295.0 | 0.7 |
| 26412.0 | 0.7 |
| 26420.0 | 0.7 |
| 26431.0 | 0.7 |
| 26445.0 | 0.7 |
| 26481.0 | 0.7 |
| 26509.0 | 0.7 |
| 26520.0 | 0.7 |
| 26527.0 | 0.7 |
| 26532.0 | 0.7 |
| 26569.0 | 0.7 |
| 26621.0 | 0.7 |
| 26653.0 | 0.7 |
| 26655.0 | 0.7 |
| 26661.0 | 0.7 |
| 26699.0 | 0.7 |
| 26746.0 | 0.7 |
| 26746.0 | 0.7 |
| 26758.0 | 0.7 |
| 26759.0 | 0.7 |
| 26774.0 | 0.7 |
| 26777.0 | 0.7 |
| 26790.0 | 0.7 |
| 26877.0 | 0.7 |
| 26908.0 | 0.7 |
| 26913.0 | 0.7 |
| 27000.0 | 0.7 |
| 27011.0 | 0.7 |
| 27027.0 | 0.7 |
| 27038.0 | 0.7 |
| 27041.0 | 0.7 |
| 27050.0 | 0.7 |
| 27093.0 | 0.7 |
| 27095.0 | 0.7 |
| 27115.0 | 0.7 |
| 27180.0 | 0.7 |
| 27275.0 | 0.7 |
| 27345.0 | 0.7 |
| 27356.0 | 0.7 |
| 27382.0 | 0.7 |
| 27436.0 | 0.7 |
| 27466.0 | 0.7 |